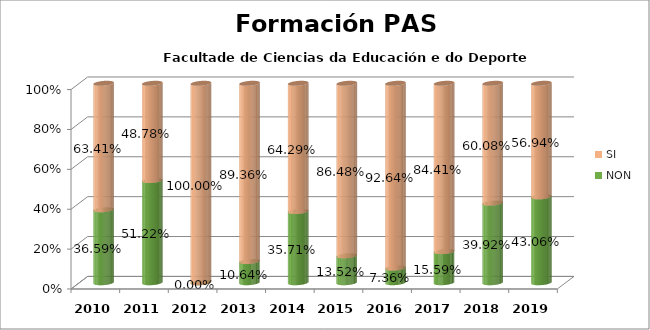
| Category | NON | SI |
|---|---|---|
| 2010.0 | 0.366 | 0.634 |
| 2011.0 | 0.512 | 0.488 |
| 2012.0 | 0 | 1 |
| 2013.0 | 0.106 | 0.894 |
| 2014.0 | 0.357 | 0.643 |
| 2015.0 | 0.135 | 0.865 |
| 2016.0 | 0.074 | 0.926 |
| 2017.0 | 0.156 | 0.844 |
| 2018.0 | 0.399 | 0.601 |
| 2019.0 | 0.431 | 0.569 |